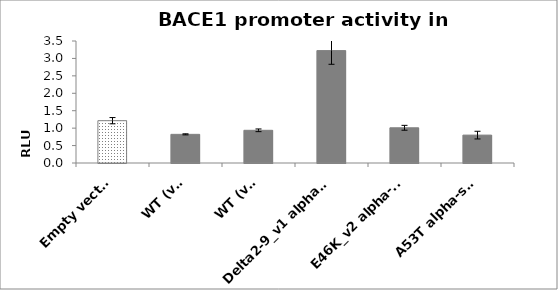
| Category | Series 0 |
|---|---|
| Empty vector | 1.214 |
| WT (v1) | 0.822 |
| WT (v3) | 0.938 |
| Delta2-9_v1 alpha-syn | 3.224 |
| E46K_v2 alpha-syn | 1.01 |
| A53T alpha-syn | 0.8 |